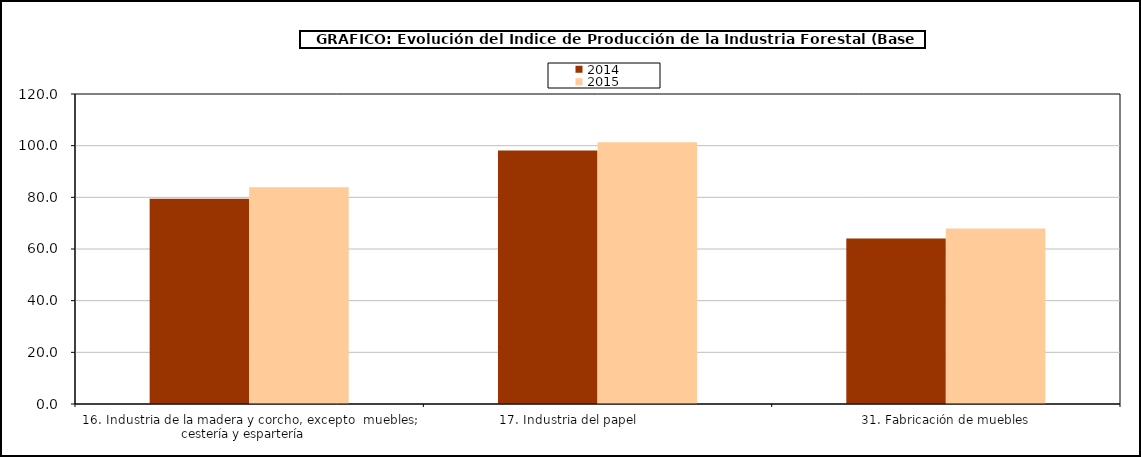
| Category | 2014 | 2015 |
|---|---|---|
| 16. Industria de la madera y corcho, excepto  muebles; cestería y espartería    | 79.424 | 83.888 |
| 17. Industria del papel                | 98.096 | 101.324 |
| 31. Fabricación de muebles | 64.109 | 67.98 |